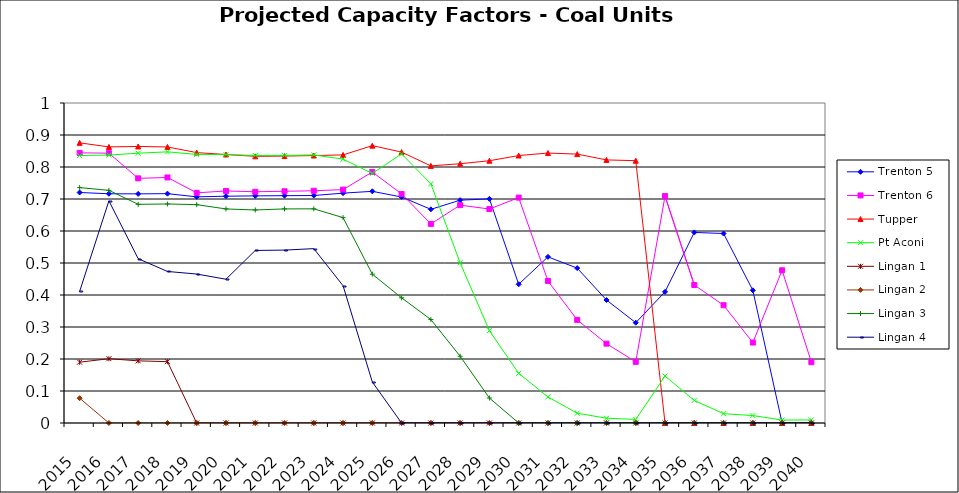
| Category | Trenton 5 | Trenton 6 | Tupper | Pt Aconi | Lingan 1 | Lingan 2 | Lingan 3 | Lingan 4 |
|---|---|---|---|---|---|---|---|---|
| 2015.0 | 0.72 | 0.844 | 0.875 | 0.836 | 0.19 | 0.078 | 0.736 | 0.411 |
| 2016.0 | 0.716 | 0.843 | 0.863 | 0.837 | 0.201 | 0 | 0.727 | 0.694 |
| 2017.0 | 0.716 | 0.765 | 0.864 | 0.843 | 0.194 | 0 | 0.683 | 0.514 |
| 2018.0 | 0.717 | 0.767 | 0.863 | 0.847 | 0.192 | 0 | 0.684 | 0.474 |
| 2019.0 | 0.707 | 0.719 | 0.845 | 0.839 | 0 | 0 | 0.682 | 0.466 |
| 2020.0 | 0.709 | 0.725 | 0.839 | 0.839 | 0 | 0 | 0.669 | 0.449 |
| 2021.0 | 0.71 | 0.723 | 0.833 | 0.836 | 0 | 0 | 0.666 | 0.539 |
| 2022.0 | 0.71 | 0.724 | 0.834 | 0.836 | 0 | 0 | 0.669 | 0.54 |
| 2023.0 | 0.711 | 0.726 | 0.836 | 0.838 | 0 | 0 | 0.669 | 0.545 |
| 2024.0 | 0.718 | 0.729 | 0.838 | 0.825 | 0 | 0 | 0.642 | 0.429 |
| 2025.0 | 0.724 | 0.784 | 0.867 | 0.78 | 0 | 0 | 0.465 | 0.128 |
| 2026.0 | 0.706 | 0.716 | 0.847 | 0.841 | 0 | 0 | 0.391 | 0 |
| 2027.0 | 0.668 | 0.622 | 0.803 | 0.747 | 0 | 0 | 0.323 | 0 |
| 2028.0 | 0.696 | 0.681 | 0.81 | 0.501 | 0 | 0 | 0.209 | 0 |
| 2029.0 | 0.7 | 0.669 | 0.82 | 0.288 | 0 | 0 | 0.078 | 0 |
| 2030.0 | 0.434 | 0.704 | 0.836 | 0.155 | 0 | 0 | 0 | 0 |
| 2031.0 | 0.519 | 0.444 | 0.844 | 0.081 | 0 | 0 | 0 | 0 |
| 2032.0 | 0.484 | 0.322 | 0.84 | 0.031 | 0 | 0 | 0 | 0 |
| 2033.0 | 0.384 | 0.248 | 0.822 | 0.015 | 0 | 0 | 0 | 0 |
| 2034.0 | 0.313 | 0.191 | 0.82 | 0.011 | 0 | 0 | 0 | 0 |
| 2035.0 | 0.41 | 0.709 | 0 | 0.147 | 0 | 0 | 0 | 0 |
| 2036.0 | 0.595 | 0.431 | 0 | 0.071 | 0 | 0 | 0 | 0 |
| 2037.0 | 0.592 | 0.368 | 0 | 0.029 | 0 | 0 | 0 | 0 |
| 2038.0 | 0.415 | 0.251 | 0 | 0.023 | 0 | 0 | 0 | 0 |
| 2039.0 | 0 | 0.477 | 0 | 0.009 | 0 | 0 | 0 | 0 |
| 2040.0 | 0 | 0.19 | 0 | 0.01 | 0 | 0 | 0 | 0 |